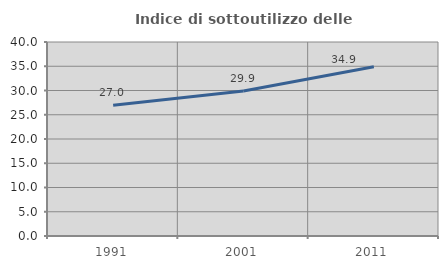
| Category | Indice di sottoutilizzo delle abitazioni  |
|---|---|
| 1991.0 | 26.955 |
| 2001.0 | 29.881 |
| 2011.0 | 34.917 |